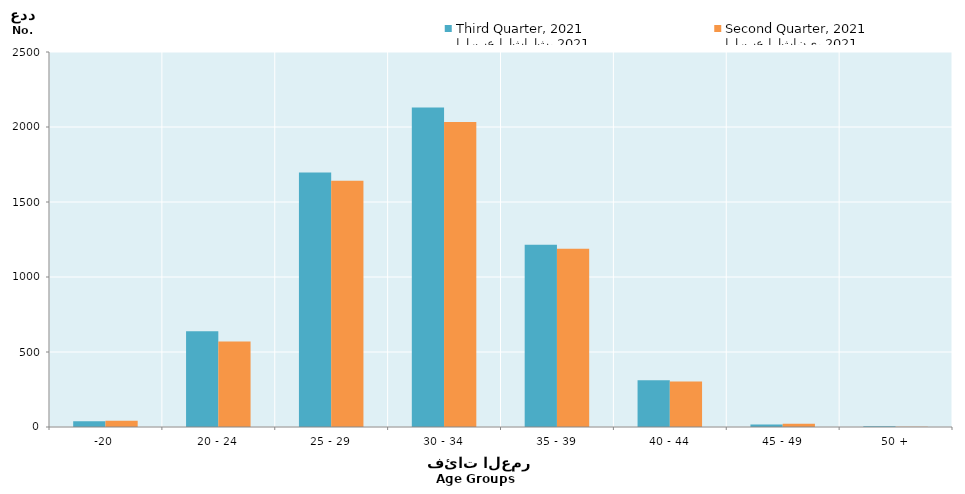
| Category | الربع الثالث، 2021
Third Quarter, 2021 | الربع الثاني، 2021
Second Quarter, 2021 |
|---|---|---|
| -20 | 39 | 42 |
| 20 - 24 | 639 | 570 |
| 25 - 29 | 1697 | 1641 |
| 30 - 34 | 2130 | 2034 |
| 35 - 39 | 1215 | 1188 |
| 40 - 44 | 311 | 304 |
| 45 - 49 | 16 | 21 |
| 50 + | 5 | 1 |